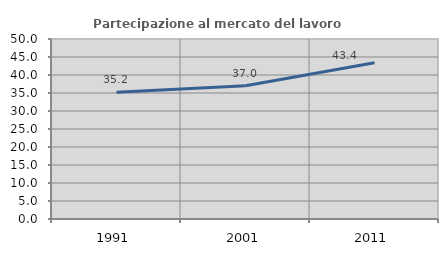
| Category | Partecipazione al mercato del lavoro  femminile |
|---|---|
| 1991.0 | 35.235 |
| 2001.0 | 37.019 |
| 2011.0 | 43.379 |